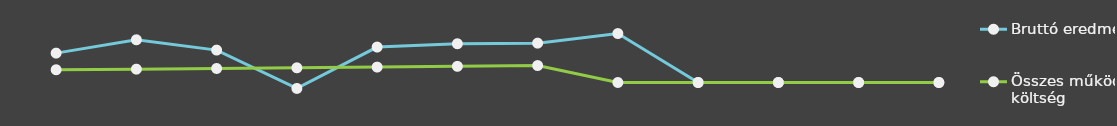
| Category | Bruttó eredmény | Összes működési költség |
|---|---|---|
| 0 | 25000 | 10841 |
| 1 | 36348 | 11367.25 |
| 2 | 27562 | 11919.82 |
| 3 | -5059.5 | 12500.01 |
| 4 | 30153.18 | 13109.21 |
| 5 | 32964.45 | 13748.86 |
| 6 | 33502.87 | 14420.51 |
| 7 | 41646 | 0 |
| 8 | 0 | 0 |
| 9 | 0 | 0 |
| 10 | 0 | 0 |
| 11 | 0 | 0 |